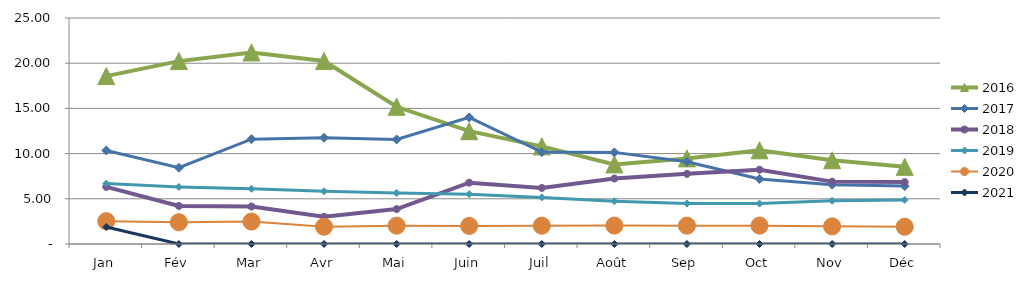
| Category | 2015 | 2016 | 2017 | 2018 | 2019 | 2020 | 2021 |
|---|---|---|---|---|---|---|---|
| Jan |  | 18.573 | 10.345 | 6.315 | 6.68 | 2.521 | 1.881 |
| Fév |  | 20.232 | 8.433 | 4.213 | 6.315 | 2.407 | 0 |
| Mar |  | 21.188 | 11.601 | 4.15 | 6.109 | 2.483 | 0 |
| Avr |  | 20.238 | 11.751 | 3.014 | 5.832 | 1.915 | 0 |
| Mai |  | 15.18 | 11.565 | 3.859 | 5.648 | 2.029 | 0 |
| Juin |  | 12.479 | 14.003 | 6.784 | 5.512 | 2.001 | 0 |
| Juil |  | 10.799 | 10.166 | 6.203 | 5.152 | 2.027 | 0 |
| Août |  | 8.807 | 10.134 | 7.245 | 4.728 | 2.036 | 0 |
| Sep |  | 9.47 | 9.094 | 7.761 | 4.477 | 2.029 | 0 |
| Oct |  | 10.362 | 7.192 | 8.218 | 4.47 | 2.032 | 0 |
| Nov |  | 9.261 | 6.564 | 6.9 | 4.782 | 1.95 | 0 |
| Déc |  | 8.534 | 6.409 | 6.846 | 4.875 | 1.91 | 0 |